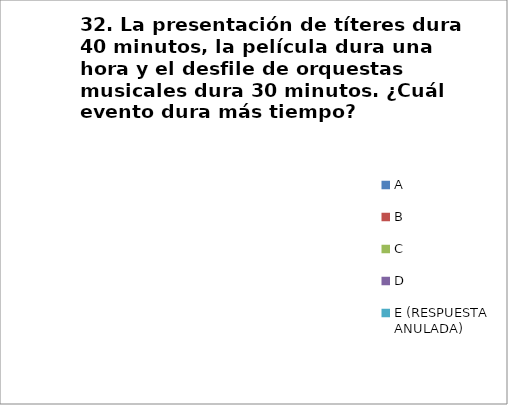
| Category | CANTIDAD DE RESPUESTAS PREGUNTA (32) | PORCENTAJE |
|---|---|---|
| A | 0 | 0 |
| B | 0 | 0 |
| C | 0 | 0 |
| D | 0 | 0 |
| E (RESPUESTA ANULADA) | 0 | 0 |